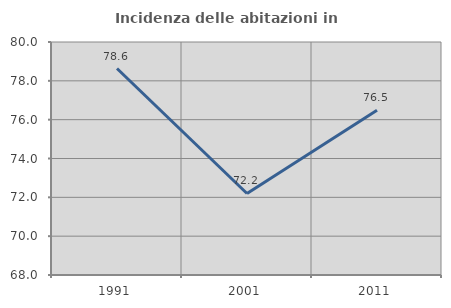
| Category | Incidenza delle abitazioni in proprietà  |
|---|---|
| 1991.0 | 78.634 |
| 2001.0 | 72.198 |
| 2011.0 | 76.487 |